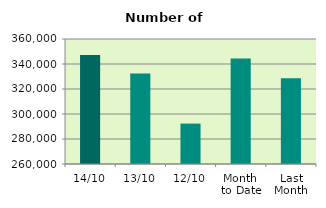
| Category | Series 0 |
|---|---|
| 14/10 | 347158 |
| 13/10 | 332478 |
| 12/10 | 292338 |
| Month 
to Date | 344329.4 |
| Last
Month | 328669.364 |